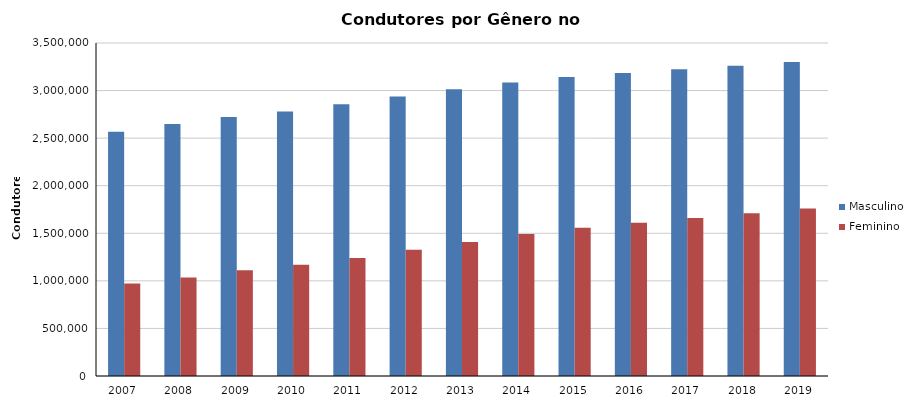
| Category | Masculino | Feminino |
|---|---|---|
| 2007 | 2567651 | 973152 |
| 2008 | 2648932 | 1034600 |
| 2009 | 2721378 | 1111796 |
| 2010 | 2779983 | 1169795 |
| 2011 | 2855558 | 1240380 |
| 2012 | 2938816 | 1326261 |
| 2013 | 3013219 | 1407204 |
| 2014 | 3085808 | 1491746 |
| 2015 | 3142055 | 1558054 |
| 2016 | 3184837 | 1610884 |
| 2017 | 3223967 | 1660393 |
| 2018 | 3262070 | 1709965 |
| 2019 | 3300653 | 1760712 |